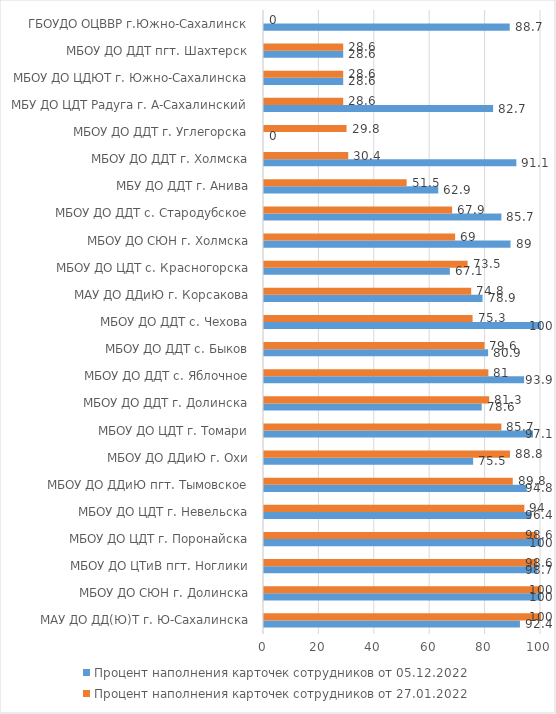
| Category | Процент наполнения карточек сотрудников от 05.12.2022 | Процент наполнения карточек сотрудников от 27.01.2022 |
|---|---|---|
| МАУ ДО ДД(Ю)Т г. Ю-Сахалинска | 92.4 | 100 |
| МБОУ ДО СЮН г. Долинска | 100 | 100 |
| МБОУ ДО ЦТиВ пгт. Ноглики | 98.7 | 98.6 |
| МБОУ ДО ЦДТ г. Поронайска | 100 | 98.6 |
| МБОУ ДО ЦДТ г. Невельска | 96.4 | 94 |
| МБОУ ДО ДДиЮ пгт. Тымовское | 94.8 | 89.8 |
| МБОУ ДО ДДиЮ г. Охи | 75.5 | 88.8 |
| МБОУ ДО ЦДТ г. Томари | 97.1 | 85.7 |
| МБОУ ДО ДДТ г. Долинска | 78.6 | 81.3 |
| МБОУ ДО ДДТ с. Яблочное | 93.9 | 81 |
| МБОУ ДО ДДТ с. Быков | 80.9 | 79.6 |
| МБОУ ДО ДДТ с. Чехова | 100 | 75.3 |
| МАУ ДО ДДиЮ г. Корсакова | 78.9 | 74.8 |
| МБОУ ДО ЦДТ с. Красногорска | 67.1 | 73.5 |
| МБОУ ДО СЮН г. Холмска | 89 | 69 |
| МБОУ ДО ДДТ с. Стародубское | 85.7 | 67.9 |
| МБУ ДО ДДТ г. Анива | 62.9 | 51.5 |
| МБОУ ДО ДДТ г. Холмска | 91.1 | 30.4 |
| МБОУ ДО ДДТ г. Углегорска | 0 | 29.8 |
| МБУ ДО ЦДТ Радуга г. А-Сахалинский | 82.7 | 28.6 |
| МБОУ ДО ЦДЮТ г. Южно-Сахалинска | 28.6 | 28.6 |
| МБОУ ДО ДДТ пгт. Шахтерск | 28.6 | 28.6 |
| ГБОУДО ОЦВВР г.Южно-Сахалинск | 88.7 | 0 |